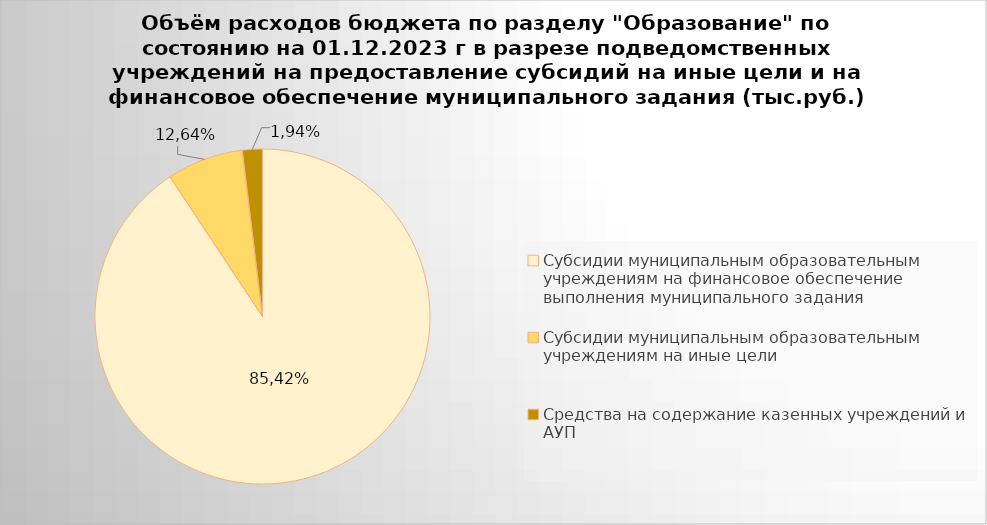
| Category | Series 0 |
|---|---|
| Субсидии муниципальным образовательным учреждениям на финансовое обеспечение выполнения муниципального задания | 7906976.31 |
| Субсидии муниципальным образовательным учреждениям на иные цели | 644495.76 |
| Средства на содержание казенных учреждений и АУП | 168393.22 |